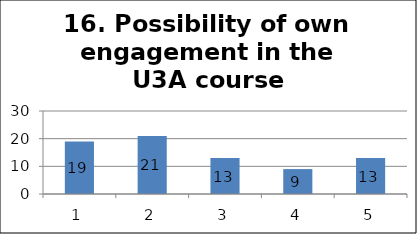
| Category | Series 1 |
|---|---|
| 0 | 19 |
| 1 | 21 |
| 2 | 13 |
| 3 | 9 |
| 4 | 13 |